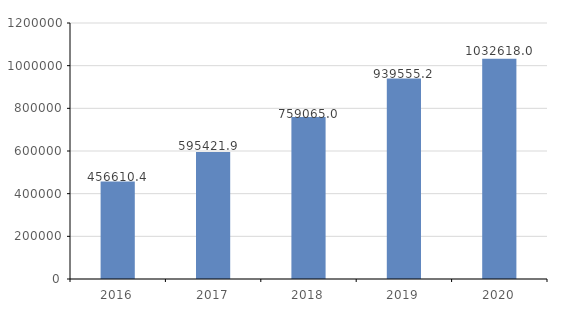
| Category | Series 0 |
|---|---|
| 2016.0 | 456610.4 |
| 2017.0 | 595421.9 |
| 2018.0 | 759065 |
| 2019.0 | 939555.2 |
| 2020.0 | 1032618 |